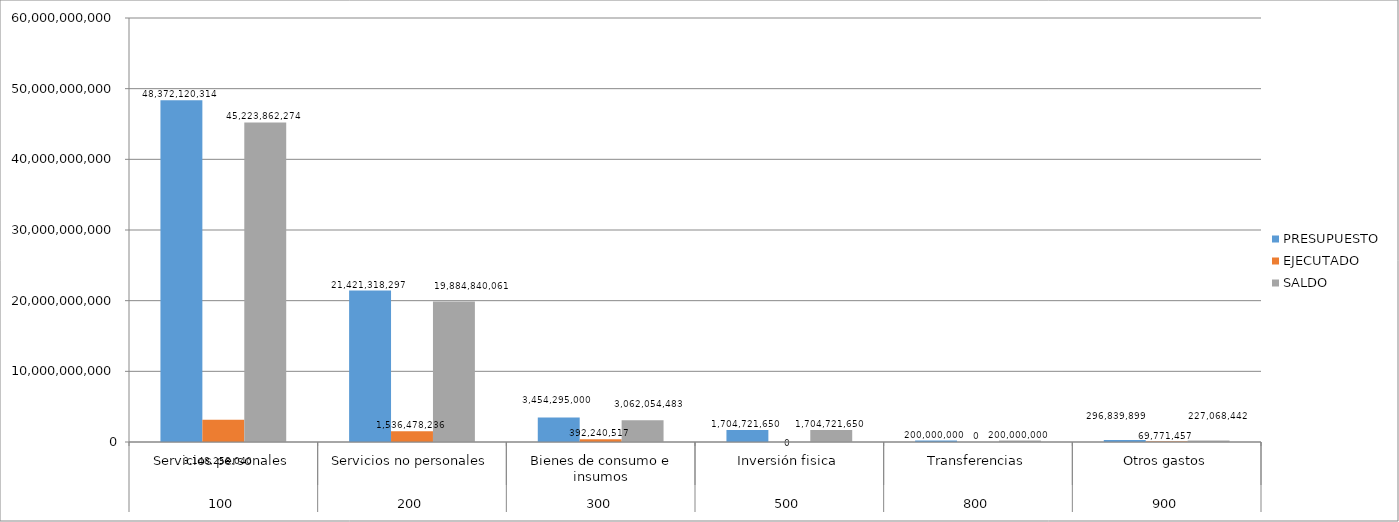
| Category | PRESUPUESTO | EJECUTADO | SALDO |
|---|---|---|---|
| 0 | 48372120314 | 3148258040 | 45223862274 |
| 1 | 21421318297 | 1536478236 | 19884840061 |
| 2 | 3454295000 | 392240517 | 3062054483 |
| 3 | 1704721650 | 0 | 1704721650 |
| 4 | 200000000 | 0 | 200000000 |
| 5 | 296839899 | 69771457 | 227068442 |